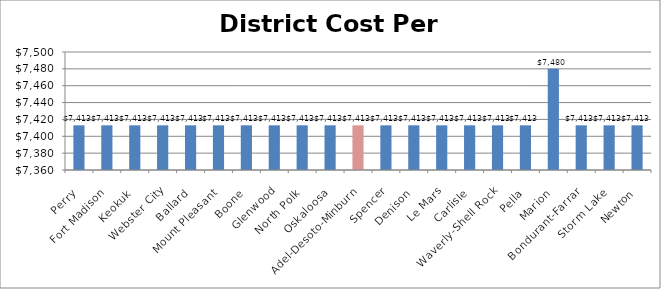
| Category | DCPP |
|---|---|
| Perry | 7413 |
| Fort Madison | 7413 |
| Keokuk | 7413 |
| Webster City | 7413 |
| Ballard | 7413 |
| Mount Pleasant | 7413 |
| Boone | 7413 |
| Glenwood | 7413 |
| North Polk | 7413 |
| Oskaloosa | 7413 |
| Adel-Desoto-Minburn | 7413 |
| Spencer | 7413 |
| Denison | 7413 |
| Le Mars | 7413 |
| Carlisle | 7413 |
| Waverly-Shell Rock | 7413 |
| Pella | 7413 |
| Marion | 7480 |
| Bondurant-Farrar | 7413 |
| Storm Lake | 7413 |
| Newton | 7413 |